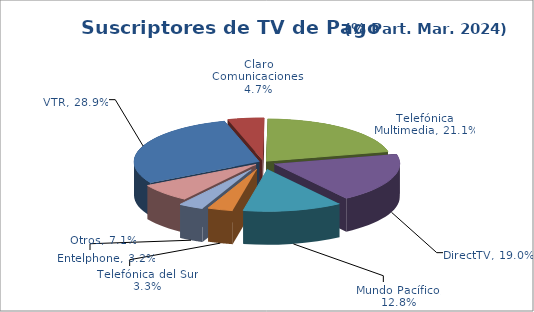
| Category | Series 0 |
|---|---|
| VTR | 0.289 |
| Claro Comunicaciones | 0.047 |
| Telefónica Multimedia | 0.211 |
| DirectTV | 0.19 |
| Mundo Pacífico | 0.128 |
| Telefónica del Sur | 0.033 |
| Entelphone | 0.032 |
| Otros | 0.071 |